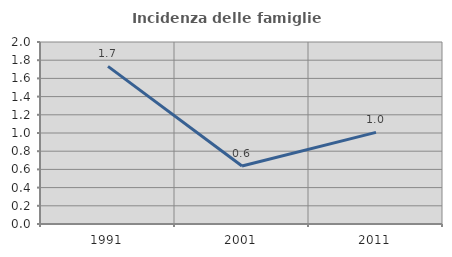
| Category | Incidenza delle famiglie numerose |
|---|---|
| 1991.0 | 1.732 |
| 2001.0 | 0.637 |
| 2011.0 | 1.007 |